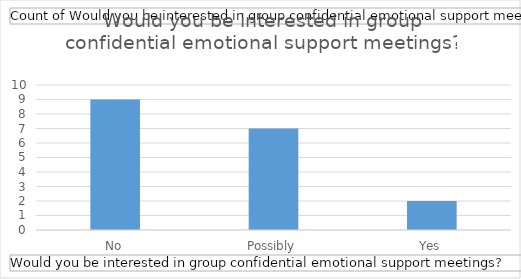
| Category | Total |
|---|---|
| No | 9 |
| Possibly | 7 |
| Yes | 2 |